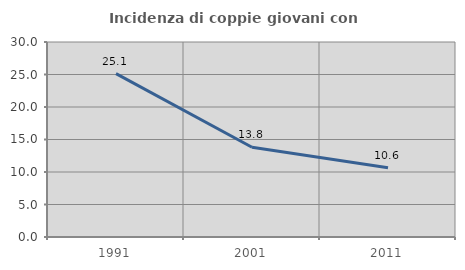
| Category | Incidenza di coppie giovani con figli |
|---|---|
| 1991.0 | 25.137 |
| 2001.0 | 13.816 |
| 2011.0 | 10.638 |